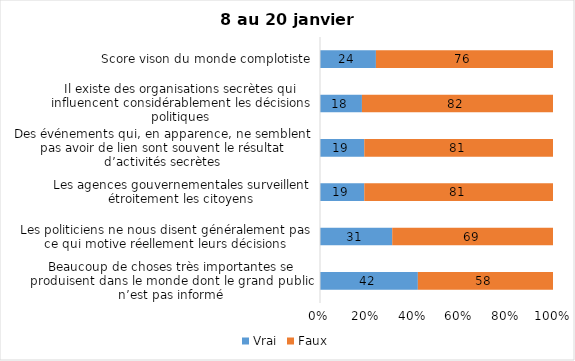
| Category | Vrai | Faux |
|---|---|---|
| Beaucoup de choses très importantes se produisent dans le monde dont le grand public n’est pas informé | 42 | 58 |
| Les politiciens ne nous disent généralement pas ce qui motive réellement leurs décisions | 31 | 69 |
| Les agences gouvernementales surveillent étroitement les citoyens | 19 | 81 |
| Des événements qui, en apparence, ne semblent pas avoir de lien sont souvent le résultat d’activités secrètes | 19 | 81 |
| Il existe des organisations secrètes qui influencent considérablement les décisions politiques | 18 | 82 |
| Score vison du monde complotiste | 24 | 76 |